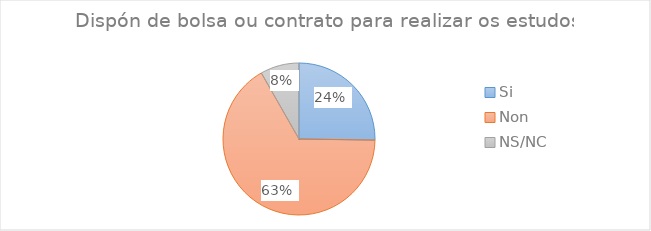
| Category | Series 0 |
|---|---|
| Si | 0.24 |
| Non | 0.633 |
| NS/NC | 0.079 |